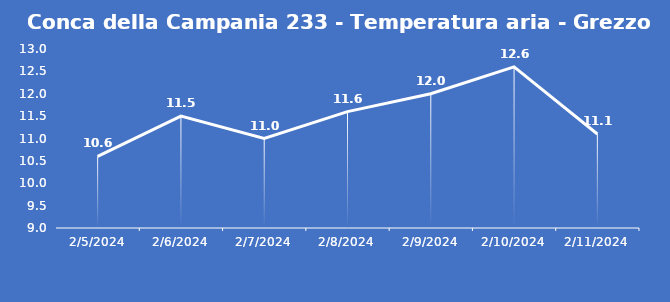
| Category | Conca della Campania 233 - Temperatura aria - Grezzo (°C) |
|---|---|
| 2/5/24 | 10.6 |
| 2/6/24 | 11.5 |
| 2/7/24 | 11 |
| 2/8/24 | 11.6 |
| 2/9/24 | 12 |
| 2/10/24 | 12.6 |
| 2/11/24 | 11.1 |